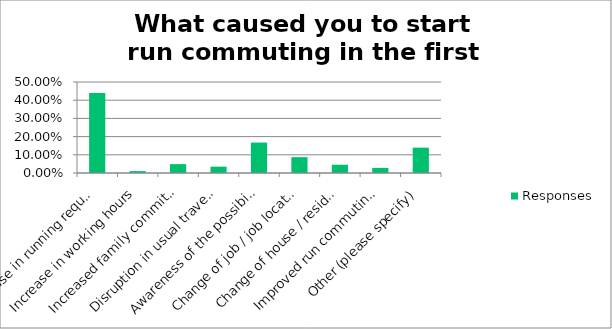
| Category | Responses |
|---|---|
| Increase in running requirements | 0.439 |
| Increase in working hours | 0.01 |
| Increased family commitments | 0.049 |
| Disruption in usual travel arrangements | 0.035 |
| Awareness of the possibility of run commuting | 0.167 |
| Change of job / job location | 0.087 |
| Change of house / residential location | 0.045 |
| Improved run commuting facilities | 0.028 |
| Other (please specify) | 0.139 |